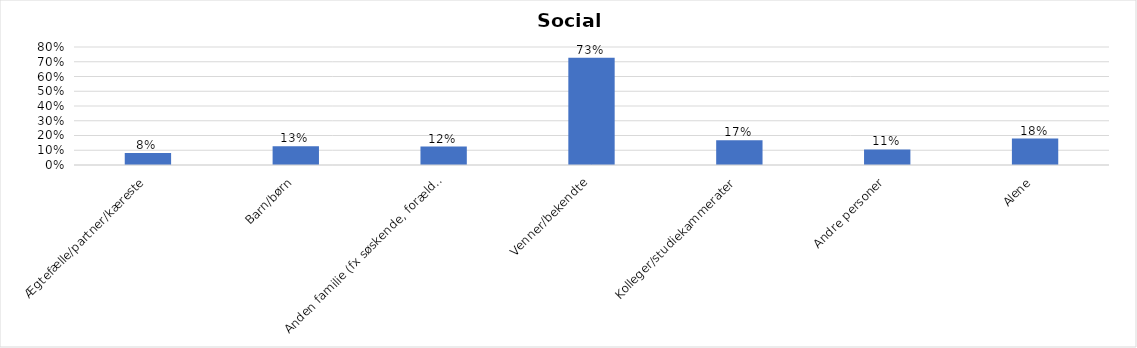
| Category | % |
|---|---|
| Ægtefælle/partner/kæreste | 0.081 |
| Barn/børn | 0.127 |
| Anden familie (fx søskende, forældre) | 0.125 |
| Venner/bekendte | 0.726 |
| Kolleger/studiekammerater | 0.168 |
| Andre personer | 0.106 |
| Alene | 0.179 |